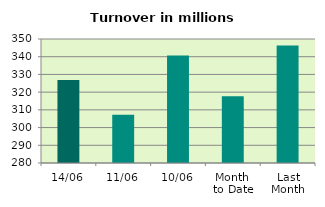
| Category | Series 0 |
|---|---|
| 14/06 | 326.818 |
| 11/06 | 307.282 |
| 10/06 | 340.696 |
| Month 
to Date | 317.701 |
| Last
Month | 346.329 |